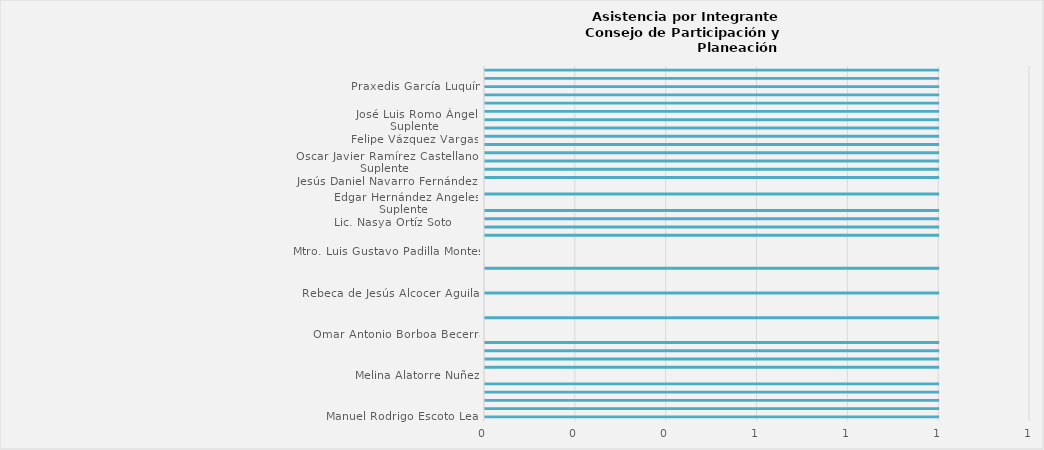
| Category | Manuel Rodrigo Escoto Leal |
|---|---|
| Manuel Rodrigo Escoto Leal | 1 |
| Paulina del Carmen Torres Padilla                                                                                    | 1 |
| Patricia Fregoso Cruz | 1 |
| Estefanía Juárez Limón | 1 |
| Ximena Buenfil Bermejo | 1 |
| Melina Alatorre Nuñez | 0 |
| Claudio Alberto de Angelis Martínez
Suplente
Kevin Arturo Peralta Rodríguez | 1 |
| Alberto Uribe Camacho
Suplente
David Sánchez Álvarez | 1 |
| Dulce Sarahí Cortés Vite
Suplente
Francisco Roberto Riverón Flores | 1 |
| Mariana Hernández González | 1 |
| Omar Antonio Borboa Becerra | 0 |
| Margarita Sierra Díaz de Rivera | 0 |
| Ing. Juan Manuel Chávez Ochoa
Suplente
Arq. Arturo Distancia Sánchez | 1 |
| Ing. Luis Enrique Barboza Niño | 0 |
| C.P. Raúl Flores López | 0 |
| Rebeca de Jesús Alcocer Aguilar | 1 |
| Salvador Mancera Sansoube | 0 |
| Estanislao Sánchez Sandoval | 0 |
| Arturo Valadez Ramírez | 1 |
| Patricia Rodríguez Guzmán | 0 |
| Mtro. Luis Gustavo Padilla Montes | 0 |
| Dr. Roberto Arias de la Mora                                                                                  | 0 |
| Saray Hernández Contreras | 1 |
| María Rosalba Rosas Cruz | 1 |
| Diego Hernández Angeles
Suplente
Mtra. María Rosas Palacios | 1 |
| Edgar Hernández Angeles
Suplente
Lic. Nasya Ortíz Soto         | 1 |
| Marissa Velázquez Ramírez | 0 |
| Alfonso Luna Flores | 1 |
| José Cruz Torres Sánchez | 0 |
| Martín Eduardo Santos Chávez | 1 |
| Oscar Javier Ramírez Castellanos
Suplente
Jesús Daniel Navarro Fernández  | 1 |
| Ismael Jáuregui Castañeda | 1 |
| Luis Enrique Ceseña Cayeros | 1 |
| Silvano Tello Corona
Suplente
María Concepción Doño Fermín | 1 |
| Ansurio Saldaña Castañeda  | 1 |
| José Luis Romo Ángel
Suplente
Felipe Vázquez Vargas  | 1 |
| Roberto Saúl Villegas Valdovinos  | 1 |
| José Luis García González  | 1 |
| Guadalupe Yolanda Padilla Jiménez | 1 |
| Minerva Ayala Ramírez | 1 |
| Praxedis García Luquín | 1 |
| Mario Fausto Flores Hernández | 1 |
| Blanca Estela Jiménez López | 1 |